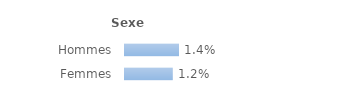
| Category | Series 0 |
|---|---|
| Hommes | 0.014 |
| Femmes | 0.012 |